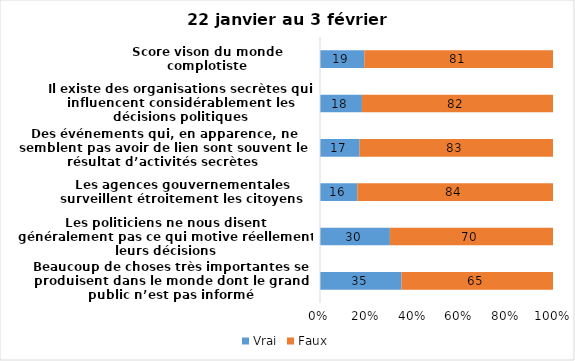
| Category | Vrai | Faux |
|---|---|---|
| Beaucoup de choses très importantes se produisent dans le monde dont le grand public n’est pas informé | 35 | 65 |
| Les politiciens ne nous disent généralement pas ce qui motive réellement leurs décisions | 30 | 70 |
| Les agences gouvernementales surveillent étroitement les citoyens | 16 | 84 |
| Des événements qui, en apparence, ne semblent pas avoir de lien sont souvent le résultat d’activités secrètes | 17 | 83 |
| Il existe des organisations secrètes qui influencent considérablement les décisions politiques | 18 | 82 |
| Score vison du monde complotiste | 19 | 81 |